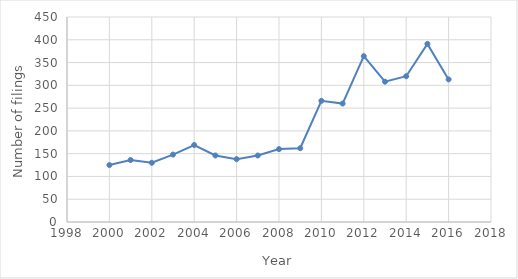
| Category | Patent Filings |
|---|---|
| 2000.0 | 125 |
| 2001.0 | 136 |
| 2002.0 | 130 |
| 2003.0 | 148 |
| 2004.0 | 169 |
| 2005.0 | 146 |
| 2006.0 | 138 |
| 2007.0 | 146 |
| 2008.0 | 160 |
| 2009.0 | 162 |
| 2010.0 | 266 |
| 2011.0 | 260 |
| 2012.0 | 364 |
| 2013.0 | 308 |
| 2014.0 | 320 |
| 2015.0 | 391 |
| 2016.0 | 313 |